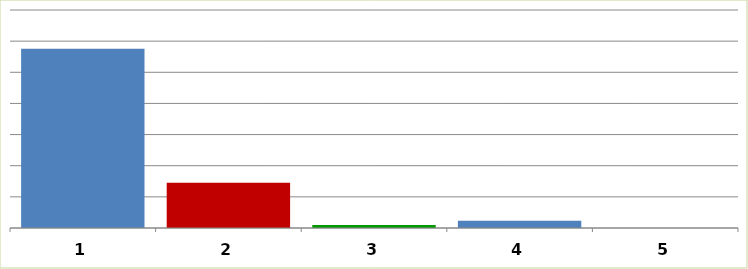
| Category | Series 0 |
|---|---|
| 0 | 115190721 |
| 1 | 29000590 |
| 2 | 1908000 |
| 3 | 4695876 |
| 4 | 0 |